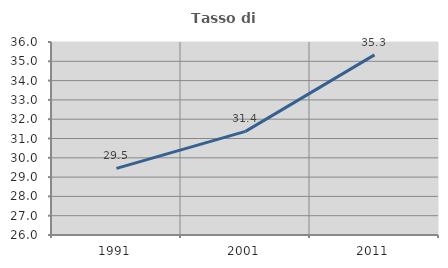
| Category | Tasso di occupazione   |
|---|---|
| 1991.0 | 29.455 |
| 2001.0 | 31.371 |
| 2011.0 | 35.331 |